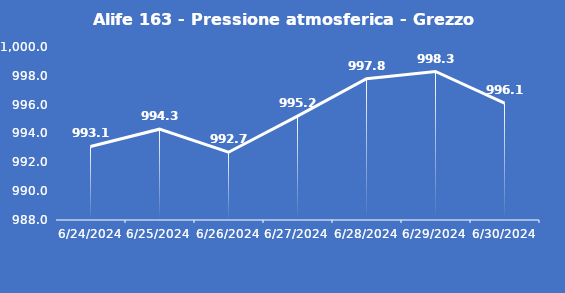
| Category | Alife 163 - Pressione atmosferica - Grezzo (hPa) |
|---|---|
| 6/24/24 | 993.1 |
| 6/25/24 | 994.3 |
| 6/26/24 | 992.7 |
| 6/27/24 | 995.2 |
| 6/28/24 | 997.8 |
| 6/29/24 | 998.3 |
| 6/30/24 | 996.1 |